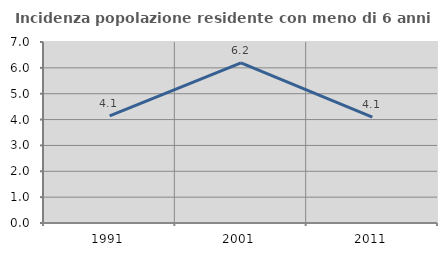
| Category | Incidenza popolazione residente con meno di 6 anni |
|---|---|
| 1991.0 | 4.139 |
| 2001.0 | 6.192 |
| 2011.0 | 4.097 |